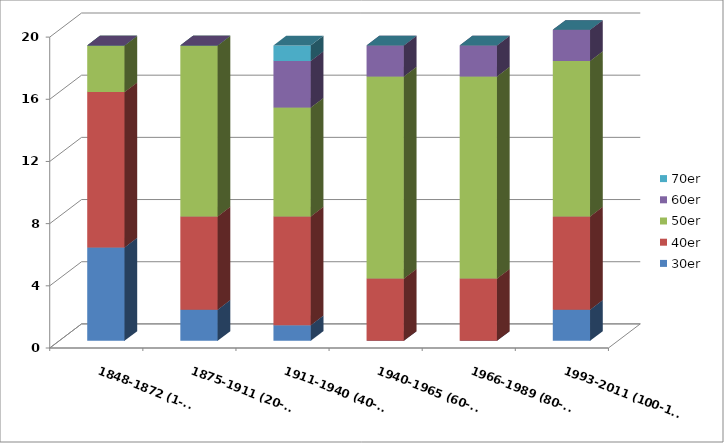
| Category | 30er | 40er | 50er | 60er  | 70er |
|---|---|---|---|---|---|
| 1848-1872 (1-19) | 6 | 10 | 3 | 0 | 0 |
| 1875-1911 (20-39) | 2 | 6 | 11 | 0 | 0 |
| 1911-1940 (40-59) | 1 | 7 | 7 | 3 | 1 |
| 1940-1965 (60-79) | 0 | 4 | 13 | 2 | 0 |
| 1966-1989 (80-99) | 0 | 4 | 13 | 2 | 0 |
| 1993-2011 (100-115) | 2 | 6 | 10 | 2 | 0 |